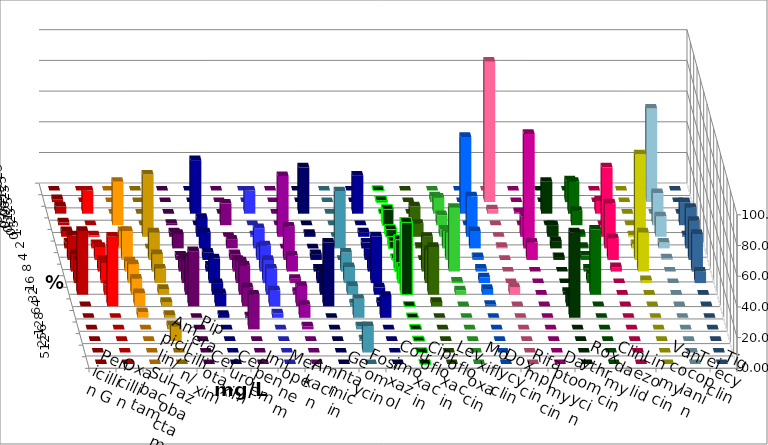
| Category | Penicillin G | Oxacillin | Ampicillin/ Sulbactam | Piperacillin/ Tazobactam | Cefotaxim | Cefuroxim | Imipenem | Meropenem | Amikacin | Gentamicin | Fosfomycin | Cotrimoxazol | Ciprofloxacin | Levofloxacin | Moxifloxacin | Doxycyclin | Rifampicin | Daptomycin | Roxythromycin | Clindamycin | Linezolid | Vancomycin | Teicoplanin | Tigecyclin |
|---|---|---|---|---|---|---|---|---|---|---|---|---|---|---|---|---|---|---|---|---|---|---|---|---|
| 0.015625 | 0 | 0 | 0 | 0 | 0 | 0 | 0 | 0 | 0 | 0 | 0 | 0 | 0 | 0 | 0 | 0 | 0 | 0 | 0 | 0 | 0 | 0 | 0 | 0 |
| 0.03125 | 1.887 | 0 | 0 | 0 | 0 | 0 | 0 | 0 | 0 | 0 | 0 | 0 | 0.943 | 0 | 3.774 | 0 | 91.509 | 0 | 0 | 14.151 | 0 | 0 | 0 | 60.952 |
| 0.0625 | 4.717 | 15.094 | 0 | 0 | 0 | 0 | 34.906 | 15.094 | 0 | 30.189 | 0 | 24.762 | 0 | 0 | 10.377 | 50 | 2.83 | 0.943 | 20.755 | 20.755 | 8.491 | 0 | 0 | 0 |
| 0.125 | 1.887 | 0 | 28.302 | 0 | 0.943 | 14.151 | 0 | 0 | 0 | 0 | 0 | 0 | 10.377 | 12.264 | 6.604 | 0 | 0 | 0 | 0 | 9.434 | 0 | 0 | 15.094 | 20.952 |
| 0.25 | 3.774 | 0.943 | 0 | 40.566 | 2.83 | 0 | 12.264 | 0.943 | 39.623 | 1.887 | 0 | 2.857 | 4.717 | 8.491 | 4.717 | 26.415 | 0 | 13.208 | 7.547 | 1.887 | 45.283 | 0.943 | 0.943 | 13.333 |
| 0.5 | 3.774 | 2.83 | 11.321 | 0 | 9.434 | 5.66 | 10.377 | 13.208 | 0 | 0 | 37.143 | 3.81 | 4.717 | 0.943 | 11.321 | 11.321 | 0.943 | 74.528 | 4.717 | 0.943 | 29.245 | 2.83 | 26.415 | 3.81 |
| 1.0 | 16.038 | 8.491 | 18.868 | 17.925 | 2.83 | 3.774 | 4.717 | 8.491 | 21.698 | 3.774 | 0 | 7.619 | 0.943 | 0 | 17.925 | 1.887 | 0 | 11.321 | 1.887 | 2.83 | 14.151 | 68.868 | 25.472 | 0.952 |
| 2.0 | 11.321 | 7.547 | 6.604 | 11.321 | 8.491 | 7.547 | 3.774 | 16.981 | 10.377 | 1.887 | 12.381 | 8.571 | 20.755 | 22.642 | 41.509 | 1.887 | 0 | 0 | 0 | 1.887 | 2.83 | 25.472 | 24.528 | 0 |
| 4.0 | 15.094 | 13.208 | 12.264 | 9.434 | 15.094 | 14.151 | 16.038 | 15.094 | 2.83 | 7.547 | 10.476 | 30.476 | 10.377 | 21.698 | 0.943 | 3.774 | 0 | 0 | 0 | 5.66 | 0 | 1.887 | 7.547 | 0 |
| 8.0 | 41.509 | 6.604 | 10.377 | 3.774 | 24.528 | 18.868 | 7.547 | 16.981 | 1.887 | 13.208 | 5.714 | 4.762 | 47.17 | 31.132 | 2.83 | 3.774 | 4.717 | 0 | 1.887 | 42.453 | 0 | 0 | 0 | 0 |
| 16.0 | 0 | 45.283 | 8.491 | 2.83 | 35.849 | 12.264 | 8.491 | 10.377 | 13.208 | 41.509 | 1.905 | 2.857 | 0 | 2.83 | 0 | 0.943 | 0 | 0 | 7.547 | 0 | 0 | 0 | 0 | 0 |
| 32.0 | 0 | 0 | 3.774 | 1.887 | 0 | 0.943 | 1.887 | 2.83 | 8.491 | 0 | 12.381 | 14.286 | 0 | 0 | 0 | 0 | 0 | 0 | 55.66 | 0 | 0 | 0 | 0 | 0 |
| 64.0 | 0 | 0 | 0 | 2.83 | 0 | 22.642 | 0 | 0 | 1.887 | 0 | 1.905 | 0 | 0 | 0 | 0 | 0 | 0 | 0 | 0 | 0 | 0 | 0 | 0 | 0 |
| 128.0 | 0 | 0 | 0 | 9.434 | 0 | 0 | 0 | 0 | 0 | 0 | 0.952 | 0 | 0 | 0 | 0 | 0 | 0 | 0 | 0 | 0 | 0 | 0 | 0 | 0 |
| 256.0 | 0 | 0 | 0 | 0 | 0 | 0 | 0 | 0 | 0 | 0 | 17.143 | 0 | 0 | 0 | 0 | 0 | 0 | 0 | 0 | 0 | 0 | 0 | 0 | 0 |
| 512.0 | 0 | 0 | 0 | 0 | 0 | 0 | 0 | 0 | 0 | 0 | 0 | 0 | 0 | 0 | 0 | 0 | 0 | 0 | 0 | 0 | 0 | 0 | 0 | 0 |